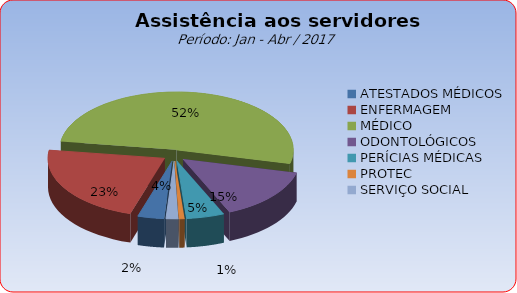
| Category | Series 0 |
|---|---|
| ATESTADOS MÉDICOS | 3.649 |
| ENFERMAGEM | 22.508 |
| MÉDICO | 51.542 |
| ODONTOLÓGICOS | 14.645 |
| PERÍCIAS MÉDICAS | 5.242 |
| PROTEC | 0.719 |
| SERVIÇO SOCIAL | 1.696 |